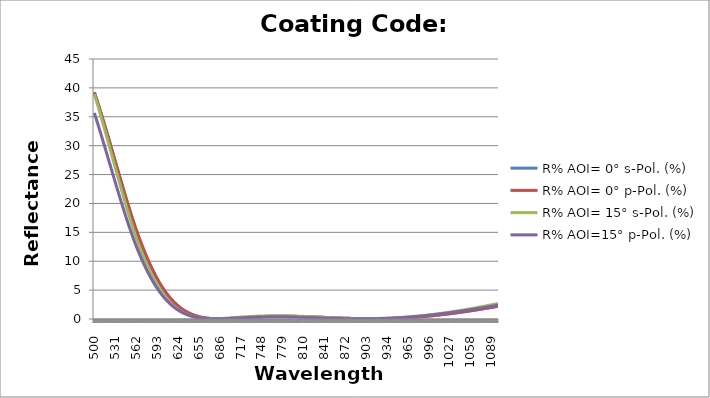
| Category | R% AOI= 0° s-Pol. (%) | R% AOI= 0° p-Pol. (%) | R% AOI= 15° s-Pol. (%) | R% AOI=15° p-Pol. (%) |
|---|---|---|---|---|
| 500.0 | 39.234 | 39.234 | 38.929 | 35.666 |
| 501.0 | 38.883 | 38.883 | 38.549 | 35.301 |
| 502.0 | 38.53 | 38.53 | 38.165 | 34.934 |
| 503.0 | 38.173 | 38.173 | 37.779 | 34.564 |
| 504.0 | 37.813 | 37.813 | 37.389 | 34.191 |
| 505.0 | 37.45 | 37.45 | 36.997 | 33.816 |
| 506.0 | 37.083 | 37.083 | 36.602 | 33.44 |
| 507.0 | 36.714 | 36.714 | 36.204 | 33.061 |
| 508.0 | 36.343 | 36.343 | 35.804 | 32.68 |
| 509.0 | 35.968 | 35.968 | 35.402 | 32.298 |
| 510.0 | 35.592 | 35.592 | 34.998 | 31.914 |
| 511.0 | 35.212 | 35.212 | 34.591 | 31.528 |
| 512.0 | 34.831 | 34.831 | 34.182 | 31.141 |
| 513.0 | 34.447 | 34.447 | 33.772 | 30.752 |
| 514.0 | 34.061 | 34.061 | 33.36 | 30.363 |
| 515.0 | 33.674 | 33.674 | 32.946 | 29.972 |
| 516.0 | 33.284 | 33.284 | 32.531 | 29.58 |
| 517.0 | 32.892 | 32.892 | 32.114 | 29.188 |
| 518.0 | 32.5 | 32.5 | 31.696 | 28.795 |
| 519.0 | 32.105 | 32.105 | 31.277 | 28.401 |
| 520.0 | 31.709 | 31.709 | 30.857 | 28.007 |
| 521.0 | 31.312 | 31.312 | 30.437 | 27.613 |
| 522.0 | 30.914 | 30.914 | 30.015 | 27.218 |
| 523.0 | 30.515 | 30.515 | 29.593 | 26.824 |
| 524.0 | 30.114 | 30.114 | 29.171 | 26.429 |
| 525.0 | 29.714 | 29.714 | 28.748 | 26.035 |
| 526.0 | 29.312 | 29.312 | 28.325 | 25.641 |
| 527.0 | 28.91 | 28.91 | 27.902 | 25.247 |
| 528.0 | 28.507 | 28.507 | 27.48 | 24.854 |
| 529.0 | 28.105 | 28.105 | 27.057 | 24.462 |
| 530.0 | 27.702 | 27.702 | 26.635 | 24.07 |
| 531.0 | 27.299 | 27.299 | 26.214 | 23.68 |
| 532.0 | 26.896 | 26.896 | 25.793 | 23.29 |
| 533.0 | 26.494 | 26.494 | 25.373 | 22.902 |
| 534.0 | 26.091 | 26.091 | 24.953 | 22.515 |
| 535.0 | 25.69 | 25.69 | 24.535 | 22.129 |
| 536.0 | 25.288 | 25.288 | 24.118 | 21.745 |
| 537.0 | 24.888 | 24.888 | 23.703 | 21.363 |
| 538.0 | 24.488 | 24.488 | 23.289 | 20.982 |
| 539.0 | 24.09 | 24.09 | 22.876 | 20.603 |
| 540.0 | 23.692 | 23.692 | 22.465 | 20.226 |
| 541.0 | 23.296 | 23.296 | 22.056 | 19.852 |
| 542.0 | 22.901 | 22.901 | 21.649 | 19.479 |
| 543.0 | 22.508 | 22.508 | 21.244 | 19.109 |
| 544.0 | 22.116 | 22.116 | 20.842 | 18.741 |
| 545.0 | 21.726 | 21.726 | 20.441 | 18.375 |
| 546.0 | 21.337 | 21.337 | 20.043 | 18.013 |
| 547.0 | 20.951 | 20.951 | 19.648 | 17.652 |
| 548.0 | 20.566 | 20.566 | 19.255 | 17.295 |
| 549.0 | 20.184 | 20.184 | 18.865 | 16.941 |
| 550.0 | 19.804 | 19.804 | 18.478 | 16.589 |
| 551.0 | 19.426 | 19.426 | 18.095 | 16.241 |
| 552.0 | 19.051 | 19.051 | 17.714 | 15.896 |
| 553.0 | 18.679 | 18.679 | 17.337 | 15.554 |
| 554.0 | 18.309 | 18.309 | 16.963 | 15.216 |
| 555.0 | 17.942 | 17.942 | 16.592 | 14.881 |
| 556.0 | 17.578 | 17.578 | 16.226 | 14.55 |
| 557.0 | 17.218 | 17.218 | 15.863 | 14.222 |
| 558.0 | 16.86 | 16.86 | 15.503 | 13.898 |
| 559.0 | 16.505 | 16.505 | 15.148 | 13.578 |
| 560.0 | 16.154 | 16.154 | 14.796 | 13.261 |
| 561.0 | 15.809 | 15.809 | 14.451 | 12.951 |
| 562.0 | 15.478 | 15.478 | 14.121 | 12.654 |
| 563.0 | 15.151 | 15.151 | 13.795 | 12.362 |
| 564.0 | 14.827 | 14.827 | 13.473 | 12.073 |
| 565.0 | 14.506 | 14.506 | 13.154 | 11.787 |
| 566.0 | 14.189 | 14.189 | 12.84 | 11.505 |
| 567.0 | 13.875 | 13.875 | 12.529 | 11.227 |
| 568.0 | 13.564 | 13.564 | 12.222 | 10.953 |
| 569.0 | 13.257 | 13.257 | 11.92 | 10.682 |
| 570.0 | 12.953 | 12.953 | 11.621 | 10.415 |
| 571.0 | 12.653 | 12.653 | 11.327 | 10.152 |
| 572.0 | 12.357 | 12.357 | 11.036 | 9.892 |
| 573.0 | 12.064 | 12.064 | 10.75 | 9.637 |
| 574.0 | 11.775 | 11.775 | 10.468 | 9.386 |
| 575.0 | 11.49 | 11.49 | 10.19 | 9.138 |
| 576.0 | 11.209 | 11.209 | 9.917 | 8.894 |
| 577.0 | 10.931 | 10.931 | 9.648 | 8.654 |
| 578.0 | 10.658 | 10.658 | 9.383 | 8.419 |
| 579.0 | 10.388 | 10.388 | 9.122 | 8.187 |
| 580.0 | 10.122 | 10.122 | 8.866 | 7.959 |
| 581.0 | 9.86 | 9.86 | 8.614 | 7.735 |
| 582.0 | 9.602 | 9.602 | 8.366 | 7.514 |
| 583.0 | 9.348 | 9.348 | 8.123 | 7.298 |
| 584.0 | 9.098 | 9.098 | 7.884 | 7.086 |
| 585.0 | 8.852 | 8.852 | 7.65 | 6.878 |
| 586.0 | 8.61 | 8.61 | 7.42 | 6.674 |
| 587.0 | 8.372 | 8.372 | 7.194 | 6.473 |
| 588.0 | 8.138 | 8.138 | 6.972 | 6.276 |
| 589.0 | 7.908 | 7.908 | 6.755 | 6.084 |
| 590.0 | 7.683 | 7.683 | 6.542 | 5.895 |
| 591.0 | 7.461 | 7.461 | 6.334 | 5.71 |
| 592.0 | 7.243 | 7.243 | 6.13 | 5.529 |
| 593.0 | 7.03 | 7.03 | 5.93 | 5.352 |
| 594.0 | 6.82 | 6.82 | 5.734 | 5.178 |
| 595.0 | 6.614 | 6.614 | 5.543 | 5.008 |
| 596.0 | 6.412 | 6.412 | 5.356 | 4.842 |
| 597.0 | 6.215 | 6.215 | 5.173 | 4.68 |
| 598.0 | 6.021 | 6.021 | 4.994 | 4.521 |
| 599.0 | 5.831 | 5.831 | 4.819 | 4.366 |
| 600.0 | 5.646 | 5.646 | 4.648 | 4.215 |
| 601.0 | 5.464 | 5.464 | 4.482 | 4.067 |
| 602.0 | 5.286 | 5.286 | 4.319 | 3.923 |
| 603.0 | 5.112 | 5.112 | 4.161 | 3.782 |
| 604.0 | 4.942 | 4.942 | 4.006 | 3.645 |
| 605.0 | 4.775 | 4.775 | 3.856 | 3.511 |
| 606.0 | 4.613 | 4.613 | 3.709 | 3.381 |
| 607.0 | 4.454 | 4.454 | 3.566 | 3.254 |
| 608.0 | 4.299 | 4.299 | 3.427 | 3.13 |
| 609.0 | 4.147 | 4.147 | 3.291 | 3.01 |
| 610.0 | 3.999 | 3.999 | 3.16 | 2.893 |
| 611.0 | 3.855 | 3.855 | 3.032 | 2.778 |
| 612.0 | 3.714 | 3.714 | 2.907 | 2.668 |
| 613.0 | 3.577 | 3.577 | 2.786 | 2.56 |
| 614.0 | 3.444 | 3.444 | 2.668 | 2.455 |
| 615.0 | 3.313 | 3.313 | 2.554 | 2.353 |
| 616.0 | 3.187 | 3.187 | 2.444 | 2.254 |
| 617.0 | 3.063 | 3.063 | 2.336 | 2.159 |
| 618.0 | 2.943 | 2.943 | 2.232 | 2.066 |
| 619.0 | 2.826 | 2.826 | 2.131 | 1.975 |
| 620.0 | 2.713 | 2.713 | 2.034 | 1.888 |
| 621.0 | 2.602 | 2.602 | 1.939 | 1.803 |
| 622.0 | 2.495 | 2.495 | 1.848 | 1.721 |
| 623.0 | 2.391 | 2.391 | 1.76 | 1.642 |
| 624.0 | 2.29 | 2.29 | 1.674 | 1.565 |
| 625.0 | 2.192 | 2.192 | 1.592 | 1.491 |
| 626.0 | 2.097 | 2.097 | 1.512 | 1.419 |
| 627.0 | 2.005 | 2.005 | 1.435 | 1.35 |
| 628.0 | 1.915 | 1.915 | 1.361 | 1.283 |
| 629.0 | 1.829 | 1.829 | 1.29 | 1.218 |
| 630.0 | 1.745 | 1.745 | 1.221 | 1.156 |
| 631.0 | 1.664 | 1.664 | 1.154 | 1.096 |
| 632.0 | 1.586 | 1.586 | 1.091 | 1.038 |
| 633.0 | 1.51 | 1.51 | 1.03 | 0.982 |
| 634.0 | 1.437 | 1.437 | 0.971 | 0.929 |
| 635.0 | 1.366 | 1.366 | 0.915 | 0.877 |
| 636.0 | 1.298 | 1.298 | 0.861 | 0.828 |
| 637.0 | 1.232 | 1.232 | 0.809 | 0.78 |
| 638.0 | 1.169 | 1.169 | 0.759 | 0.735 |
| 639.0 | 1.108 | 1.108 | 0.712 | 0.691 |
| 640.0 | 1.049 | 1.049 | 0.667 | 0.649 |
| 641.0 | 0.992 | 0.992 | 0.623 | 0.609 |
| 642.0 | 0.938 | 0.938 | 0.582 | 0.571 |
| 643.0 | 0.886 | 0.886 | 0.543 | 0.534 |
| 644.0 | 0.836 | 0.836 | 0.505 | 0.499 |
| 645.0 | 0.788 | 0.788 | 0.47 | 0.466 |
| 646.0 | 0.742 | 0.742 | 0.436 | 0.434 |
| 647.0 | 0.697 | 0.697 | 0.404 | 0.404 |
| 648.0 | 0.655 | 0.655 | 0.374 | 0.375 |
| 649.0 | 0.615 | 0.615 | 0.345 | 0.348 |
| 650.0 | 0.576 | 0.576 | 0.318 | 0.322 |
| 651.0 | 0.539 | 0.539 | 0.293 | 0.298 |
| 652.0 | 0.504 | 0.504 | 0.269 | 0.274 |
| 653.0 | 0.47 | 0.47 | 0.247 | 0.253 |
| 654.0 | 0.439 | 0.439 | 0.226 | 0.232 |
| 655.0 | 0.408 | 0.408 | 0.206 | 0.213 |
| 656.0 | 0.38 | 0.38 | 0.188 | 0.194 |
| 657.0 | 0.352 | 0.352 | 0.171 | 0.177 |
| 658.0 | 0.327 | 0.327 | 0.156 | 0.161 |
| 659.0 | 0.302 | 0.302 | 0.141 | 0.146 |
| 660.0 | 0.279 | 0.279 | 0.128 | 0.132 |
| 661.0 | 0.258 | 0.258 | 0.116 | 0.12 |
| 662.0 | 0.237 | 0.237 | 0.105 | 0.108 |
| 663.0 | 0.218 | 0.218 | 0.095 | 0.097 |
| 664.0 | 0.2 | 0.2 | 0.086 | 0.087 |
| 665.0 | 0.184 | 0.184 | 0.078 | 0.078 |
| 666.0 | 0.168 | 0.168 | 0.071 | 0.069 |
| 667.0 | 0.154 | 0.154 | 0.065 | 0.062 |
| 668.0 | 0.141 | 0.141 | 0.06 | 0.055 |
| 669.0 | 0.129 | 0.129 | 0.055 | 0.049 |
| 670.0 | 0.117 | 0.117 | 0.052 | 0.044 |
| 671.0 | 0.107 | 0.107 | 0.049 | 0.039 |
| 672.0 | 0.097 | 0.097 | 0.046 | 0.035 |
| 673.0 | 0.089 | 0.089 | 0.045 | 0.032 |
| 674.0 | 0.081 | 0.081 | 0.044 | 0.029 |
| 675.0 | 0.074 | 0.074 | 0.044 | 0.027 |
| 676.0 | 0.068 | 0.068 | 0.045 | 0.026 |
| 677.0 | 0.063 | 0.063 | 0.046 | 0.025 |
| 678.0 | 0.058 | 0.058 | 0.048 | 0.024 |
| 679.0 | 0.054 | 0.054 | 0.05 | 0.024 |
| 680.0 | 0.051 | 0.051 | 0.052 | 0.024 |
| 681.0 | 0.048 | 0.048 | 0.056 | 0.025 |
| 682.0 | 0.046 | 0.046 | 0.059 | 0.026 |
| 683.0 | 0.045 | 0.045 | 0.063 | 0.028 |
| 684.0 | 0.044 | 0.044 | 0.068 | 0.03 |
| 685.0 | 0.044 | 0.044 | 0.073 | 0.032 |
| 686.0 | 0.044 | 0.044 | 0.078 | 0.035 |
| 687.0 | 0.045 | 0.045 | 0.084 | 0.038 |
| 688.0 | 0.046 | 0.046 | 0.09 | 0.042 |
| 689.0 | 0.048 | 0.048 | 0.096 | 0.045 |
| 690.0 | 0.05 | 0.05 | 0.102 | 0.049 |
| 691.0 | 0.053 | 0.053 | 0.109 | 0.053 |
| 692.0 | 0.056 | 0.056 | 0.116 | 0.058 |
| 693.0 | 0.059 | 0.059 | 0.123 | 0.062 |
| 694.0 | 0.063 | 0.063 | 0.131 | 0.067 |
| 695.0 | 0.067 | 0.067 | 0.138 | 0.072 |
| 696.0 | 0.071 | 0.071 | 0.146 | 0.077 |
| 697.0 | 0.076 | 0.076 | 0.154 | 0.083 |
| 698.0 | 0.081 | 0.081 | 0.162 | 0.088 |
| 699.0 | 0.086 | 0.086 | 0.17 | 0.094 |
| 700.0 | 0.091 | 0.091 | 0.179 | 0.1 |
| 701.0 | 0.097 | 0.097 | 0.187 | 0.105 |
| 702.0 | 0.102 | 0.102 | 0.196 | 0.111 |
| 703.0 | 0.108 | 0.108 | 0.204 | 0.117 |
| 704.0 | 0.115 | 0.115 | 0.213 | 0.124 |
| 705.0 | 0.121 | 0.121 | 0.222 | 0.13 |
| 706.0 | 0.128 | 0.128 | 0.23 | 0.136 |
| 707.0 | 0.134 | 0.134 | 0.239 | 0.142 |
| 708.0 | 0.141 | 0.141 | 0.248 | 0.148 |
| 709.0 | 0.148 | 0.148 | 0.257 | 0.155 |
| 710.0 | 0.155 | 0.155 | 0.265 | 0.161 |
| 711.0 | 0.162 | 0.162 | 0.274 | 0.167 |
| 712.0 | 0.169 | 0.169 | 0.283 | 0.174 |
| 713.0 | 0.176 | 0.176 | 0.291 | 0.18 |
| 714.0 | 0.183 | 0.183 | 0.3 | 0.186 |
| 715.0 | 0.19 | 0.19 | 0.308 | 0.192 |
| 716.0 | 0.197 | 0.197 | 0.317 | 0.199 |
| 717.0 | 0.205 | 0.205 | 0.325 | 0.205 |
| 718.0 | 0.212 | 0.212 | 0.334 | 0.211 |
| 719.0 | 0.219 | 0.219 | 0.342 | 0.217 |
| 720.0 | 0.226 | 0.226 | 0.35 | 0.223 |
| 721.0 | 0.234 | 0.234 | 0.358 | 0.229 |
| 722.0 | 0.241 | 0.241 | 0.366 | 0.235 |
| 723.0 | 0.248 | 0.248 | 0.373 | 0.24 |
| 724.0 | 0.255 | 0.255 | 0.381 | 0.246 |
| 725.0 | 0.262 | 0.262 | 0.389 | 0.252 |
| 726.0 | 0.269 | 0.269 | 0.396 | 0.257 |
| 727.0 | 0.276 | 0.276 | 0.403 | 0.263 |
| 728.0 | 0.283 | 0.283 | 0.41 | 0.268 |
| 729.0 | 0.29 | 0.29 | 0.417 | 0.273 |
| 730.0 | 0.297 | 0.297 | 0.424 | 0.278 |
| 731.0 | 0.303 | 0.303 | 0.431 | 0.283 |
| 732.0 | 0.31 | 0.31 | 0.437 | 0.288 |
| 733.0 | 0.316 | 0.316 | 0.443 | 0.293 |
| 734.0 | 0.323 | 0.323 | 0.45 | 0.298 |
| 735.0 | 0.329 | 0.329 | 0.456 | 0.302 |
| 736.0 | 0.336 | 0.336 | 0.462 | 0.307 |
| 737.0 | 0.342 | 0.342 | 0.469 | 0.312 |
| 738.0 | 0.348 | 0.348 | 0.475 | 0.316 |
| 739.0 | 0.355 | 0.355 | 0.48 | 0.321 |
| 740.0 | 0.361 | 0.361 | 0.486 | 0.325 |
| 741.0 | 0.367 | 0.367 | 0.492 | 0.329 |
| 742.0 | 0.372 | 0.372 | 0.497 | 0.333 |
| 743.0 | 0.378 | 0.378 | 0.502 | 0.337 |
| 744.0 | 0.384 | 0.384 | 0.507 | 0.341 |
| 745.0 | 0.389 | 0.389 | 0.511 | 0.344 |
| 746.0 | 0.394 | 0.394 | 0.516 | 0.348 |
| 747.0 | 0.399 | 0.399 | 0.52 | 0.351 |
| 748.0 | 0.404 | 0.404 | 0.525 | 0.354 |
| 749.0 | 0.409 | 0.409 | 0.529 | 0.357 |
| 750.0 | 0.414 | 0.414 | 0.532 | 0.36 |
| 751.0 | 0.418 | 0.418 | 0.536 | 0.363 |
| 752.0 | 0.423 | 0.423 | 0.539 | 0.365 |
| 753.0 | 0.427 | 0.427 | 0.543 | 0.368 |
| 754.0 | 0.431 | 0.431 | 0.546 | 0.37 |
| 755.0 | 0.435 | 0.435 | 0.548 | 0.372 |
| 756.0 | 0.438 | 0.438 | 0.551 | 0.374 |
| 757.0 | 0.442 | 0.442 | 0.554 | 0.376 |
| 758.0 | 0.445 | 0.445 | 0.556 | 0.377 |
| 759.0 | 0.449 | 0.449 | 0.558 | 0.379 |
| 760.0 | 0.452 | 0.452 | 0.56 | 0.38 |
| 761.0 | 0.455 | 0.455 | 0.562 | 0.382 |
| 762.0 | 0.457 | 0.457 | 0.563 | 0.383 |
| 763.0 | 0.46 | 0.46 | 0.564 | 0.384 |
| 764.0 | 0.462 | 0.462 | 0.566 | 0.384 |
| 765.0 | 0.465 | 0.465 | 0.567 | 0.385 |
| 766.0 | 0.467 | 0.467 | 0.567 | 0.386 |
| 767.0 | 0.469 | 0.469 | 0.568 | 0.386 |
| 768.0 | 0.47 | 0.47 | 0.568 | 0.386 |
| 769.0 | 0.472 | 0.472 | 0.569 | 0.387 |
| 770.0 | 0.473 | 0.473 | 0.569 | 0.387 |
| 771.0 | 0.475 | 0.475 | 0.569 | 0.386 |
| 772.0 | 0.476 | 0.476 | 0.568 | 0.386 |
| 773.0 | 0.477 | 0.477 | 0.568 | 0.386 |
| 774.0 | 0.478 | 0.478 | 0.568 | 0.385 |
| 775.0 | 0.478 | 0.478 | 0.567 | 0.385 |
| 776.0 | 0.479 | 0.479 | 0.566 | 0.384 |
| 777.0 | 0.479 | 0.479 | 0.565 | 0.383 |
| 778.0 | 0.479 | 0.479 | 0.564 | 0.382 |
| 779.0 | 0.48 | 0.48 | 0.562 | 0.381 |
| 780.0 | 0.479 | 0.479 | 0.561 | 0.38 |
| 781.0 | 0.479 | 0.479 | 0.559 | 0.378 |
| 782.0 | 0.479 | 0.479 | 0.557 | 0.377 |
| 783.0 | 0.478 | 0.478 | 0.555 | 0.375 |
| 784.0 | 0.478 | 0.478 | 0.553 | 0.373 |
| 785.0 | 0.477 | 0.477 | 0.551 | 0.372 |
| 786.0 | 0.476 | 0.476 | 0.549 | 0.37 |
| 787.0 | 0.475 | 0.475 | 0.546 | 0.368 |
| 788.0 | 0.474 | 0.474 | 0.543 | 0.366 |
| 789.0 | 0.472 | 0.472 | 0.541 | 0.363 |
| 790.0 | 0.471 | 0.471 | 0.538 | 0.361 |
| 791.0 | 0.469 | 0.469 | 0.535 | 0.359 |
| 792.0 | 0.467 | 0.467 | 0.532 | 0.356 |
| 793.0 | 0.466 | 0.466 | 0.528 | 0.353 |
| 794.0 | 0.464 | 0.464 | 0.525 | 0.351 |
| 795.0 | 0.461 | 0.461 | 0.521 | 0.348 |
| 796.0 | 0.459 | 0.459 | 0.518 | 0.345 |
| 797.0 | 0.457 | 0.457 | 0.514 | 0.342 |
| 798.0 | 0.454 | 0.454 | 0.51 | 0.339 |
| 799.0 | 0.452 | 0.452 | 0.506 | 0.336 |
| 800.0 | 0.449 | 0.449 | 0.502 | 0.333 |
| 801.0 | 0.446 | 0.446 | 0.498 | 0.33 |
| 802.0 | 0.443 | 0.443 | 0.494 | 0.326 |
| 803.0 | 0.44 | 0.44 | 0.489 | 0.323 |
| 804.0 | 0.437 | 0.437 | 0.485 | 0.319 |
| 805.0 | 0.434 | 0.434 | 0.48 | 0.316 |
| 806.0 | 0.431 | 0.431 | 0.476 | 0.312 |
| 807.0 | 0.428 | 0.428 | 0.471 | 0.309 |
| 808.0 | 0.424 | 0.424 | 0.466 | 0.305 |
| 809.0 | 0.42 | 0.42 | 0.462 | 0.301 |
| 810.0 | 0.417 | 0.417 | 0.457 | 0.297 |
| 811.0 | 0.413 | 0.413 | 0.452 | 0.294 |
| 812.0 | 0.409 | 0.409 | 0.447 | 0.29 |
| 813.0 | 0.405 | 0.405 | 0.442 | 0.286 |
| 814.0 | 0.402 | 0.402 | 0.437 | 0.282 |
| 815.0 | 0.398 | 0.398 | 0.432 | 0.278 |
| 816.0 | 0.393 | 0.393 | 0.426 | 0.274 |
| 817.0 | 0.389 | 0.389 | 0.421 | 0.27 |
| 818.0 | 0.385 | 0.385 | 0.416 | 0.266 |
| 819.0 | 0.381 | 0.381 | 0.41 | 0.261 |
| 820.0 | 0.376 | 0.376 | 0.405 | 0.257 |
| 821.0 | 0.372 | 0.372 | 0.4 | 0.253 |
| 822.0 | 0.368 | 0.368 | 0.394 | 0.249 |
| 823.0 | 0.363 | 0.363 | 0.389 | 0.245 |
| 824.0 | 0.358 | 0.358 | 0.383 | 0.24 |
| 825.0 | 0.354 | 0.354 | 0.378 | 0.236 |
| 826.0 | 0.349 | 0.349 | 0.372 | 0.232 |
| 827.0 | 0.344 | 0.344 | 0.366 | 0.228 |
| 828.0 | 0.34 | 0.34 | 0.361 | 0.223 |
| 829.0 | 0.335 | 0.335 | 0.355 | 0.219 |
| 830.0 | 0.33 | 0.33 | 0.349 | 0.215 |
| 831.0 | 0.325 | 0.325 | 0.344 | 0.21 |
| 832.0 | 0.321 | 0.321 | 0.338 | 0.206 |
| 833.0 | 0.316 | 0.316 | 0.332 | 0.202 |
| 834.0 | 0.311 | 0.311 | 0.327 | 0.198 |
| 835.0 | 0.306 | 0.306 | 0.321 | 0.193 |
| 836.0 | 0.301 | 0.301 | 0.316 | 0.189 |
| 837.0 | 0.296 | 0.296 | 0.31 | 0.185 |
| 838.0 | 0.291 | 0.291 | 0.304 | 0.18 |
| 839.0 | 0.286 | 0.286 | 0.299 | 0.176 |
| 840.0 | 0.281 | 0.281 | 0.293 | 0.172 |
| 841.0 | 0.276 | 0.276 | 0.287 | 0.168 |
| 842.0 | 0.271 | 0.271 | 0.282 | 0.164 |
| 843.0 | 0.266 | 0.266 | 0.276 | 0.16 |
| 844.0 | 0.261 | 0.261 | 0.271 | 0.156 |
| 845.0 | 0.256 | 0.256 | 0.265 | 0.152 |
| 846.0 | 0.251 | 0.251 | 0.26 | 0.148 |
| 847.0 | 0.246 | 0.246 | 0.255 | 0.144 |
| 848.0 | 0.242 | 0.242 | 0.249 | 0.14 |
| 849.0 | 0.237 | 0.237 | 0.244 | 0.136 |
| 850.0 | 0.232 | 0.232 | 0.239 | 0.132 |
| 851.0 | 0.227 | 0.227 | 0.234 | 0.128 |
| 852.0 | 0.222 | 0.222 | 0.228 | 0.124 |
| 853.0 | 0.217 | 0.217 | 0.223 | 0.121 |
| 854.0 | 0.212 | 0.212 | 0.218 | 0.117 |
| 855.0 | 0.208 | 0.208 | 0.213 | 0.113 |
| 856.0 | 0.203 | 0.203 | 0.208 | 0.11 |
| 857.0 | 0.198 | 0.198 | 0.203 | 0.106 |
| 858.0 | 0.194 | 0.194 | 0.198 | 0.103 |
| 859.0 | 0.189 | 0.189 | 0.194 | 0.1 |
| 860.0 | 0.184 | 0.184 | 0.189 | 0.096 |
| 861.0 | 0.18 | 0.18 | 0.184 | 0.093 |
| 862.0 | 0.175 | 0.175 | 0.18 | 0.09 |
| 863.0 | 0.171 | 0.171 | 0.175 | 0.087 |
| 864.0 | 0.166 | 0.166 | 0.171 | 0.084 |
| 865.0 | 0.162 | 0.162 | 0.166 | 0.081 |
| 866.0 | 0.158 | 0.158 | 0.162 | 0.078 |
| 867.0 | 0.154 | 0.154 | 0.158 | 0.075 |
| 868.0 | 0.149 | 0.149 | 0.154 | 0.072 |
| 869.0 | 0.145 | 0.145 | 0.15 | 0.069 |
| 870.0 | 0.141 | 0.141 | 0.146 | 0.067 |
| 871.0 | 0.137 | 0.137 | 0.142 | 0.064 |
| 872.0 | 0.133 | 0.133 | 0.138 | 0.062 |
| 873.0 | 0.129 | 0.129 | 0.135 | 0.059 |
| 874.0 | 0.126 | 0.126 | 0.131 | 0.057 |
| 875.0 | 0.122 | 0.122 | 0.128 | 0.055 |
| 876.0 | 0.118 | 0.118 | 0.124 | 0.053 |
| 877.0 | 0.114 | 0.114 | 0.121 | 0.051 |
| 878.0 | 0.111 | 0.111 | 0.118 | 0.049 |
| 879.0 | 0.108 | 0.108 | 0.115 | 0.047 |
| 880.0 | 0.104 | 0.104 | 0.112 | 0.045 |
| 881.0 | 0.101 | 0.101 | 0.109 | 0.044 |
| 882.0 | 0.098 | 0.098 | 0.106 | 0.042 |
| 883.0 | 0.095 | 0.095 | 0.104 | 0.041 |
| 884.0 | 0.092 | 0.092 | 0.101 | 0.039 |
| 885.0 | 0.089 | 0.089 | 0.099 | 0.038 |
| 886.0 | 0.086 | 0.086 | 0.097 | 0.037 |
| 887.0 | 0.083 | 0.083 | 0.094 | 0.036 |
| 888.0 | 0.08 | 0.08 | 0.092 | 0.035 |
| 889.0 | 0.078 | 0.078 | 0.09 | 0.034 |
| 890.0 | 0.075 | 0.075 | 0.089 | 0.033 |
| 891.0 | 0.073 | 0.073 | 0.087 | 0.032 |
| 892.0 | 0.071 | 0.071 | 0.085 | 0.032 |
| 893.0 | 0.069 | 0.069 | 0.084 | 0.031 |
| 894.0 | 0.066 | 0.066 | 0.083 | 0.031 |
| 895.0 | 0.064 | 0.064 | 0.081 | 0.031 |
| 896.0 | 0.063 | 0.063 | 0.08 | 0.031 |
| 897.0 | 0.061 | 0.061 | 0.079 | 0.031 |
| 898.0 | 0.059 | 0.059 | 0.078 | 0.031 |
| 899.0 | 0.058 | 0.058 | 0.078 | 0.031 |
| 900.0 | 0.056 | 0.056 | 0.077 | 0.031 |
| 901.0 | 0.055 | 0.055 | 0.077 | 0.032 |
| 902.0 | 0.053 | 0.053 | 0.076 | 0.032 |
| 903.0 | 0.052 | 0.052 | 0.076 | 0.033 |
| 904.0 | 0.051 | 0.051 | 0.076 | 0.034 |
| 905.0 | 0.05 | 0.05 | 0.076 | 0.035 |
| 906.0 | 0.05 | 0.05 | 0.077 | 0.036 |
| 907.0 | 0.049 | 0.049 | 0.077 | 0.037 |
| 908.0 | 0.048 | 0.048 | 0.078 | 0.038 |
| 909.0 | 0.048 | 0.048 | 0.078 | 0.04 |
| 910.0 | 0.047 | 0.047 | 0.079 | 0.041 |
| 911.0 | 0.047 | 0.047 | 0.08 | 0.043 |
| 912.0 | 0.047 | 0.047 | 0.081 | 0.044 |
| 913.0 | 0.047 | 0.047 | 0.082 | 0.046 |
| 914.0 | 0.047 | 0.047 | 0.084 | 0.048 |
| 915.0 | 0.047 | 0.047 | 0.085 | 0.05 |
| 916.0 | 0.048 | 0.048 | 0.087 | 0.052 |
| 917.0 | 0.048 | 0.048 | 0.088 | 0.055 |
| 918.0 | 0.049 | 0.049 | 0.09 | 0.057 |
| 919.0 | 0.05 | 0.05 | 0.092 | 0.06 |
| 920.0 | 0.05 | 0.05 | 0.095 | 0.063 |
| 921.0 | 0.052 | 0.052 | 0.097 | 0.066 |
| 922.0 | 0.053 | 0.053 | 0.1 | 0.068 |
| 923.0 | 0.054 | 0.054 | 0.102 | 0.072 |
| 924.0 | 0.055 | 0.055 | 0.105 | 0.075 |
| 925.0 | 0.057 | 0.057 | 0.108 | 0.078 |
| 926.0 | 0.058 | 0.058 | 0.111 | 0.082 |
| 927.0 | 0.06 | 0.06 | 0.114 | 0.085 |
| 928.0 | 0.062 | 0.062 | 0.118 | 0.089 |
| 929.0 | 0.064 | 0.064 | 0.121 | 0.093 |
| 930.0 | 0.066 | 0.066 | 0.125 | 0.097 |
| 931.0 | 0.068 | 0.068 | 0.129 | 0.101 |
| 932.0 | 0.071 | 0.071 | 0.133 | 0.105 |
| 933.0 | 0.073 | 0.073 | 0.137 | 0.11 |
| 934.0 | 0.076 | 0.076 | 0.141 | 0.114 |
| 935.0 | 0.079 | 0.079 | 0.146 | 0.119 |
| 936.0 | 0.082 | 0.082 | 0.15 | 0.124 |
| 937.0 | 0.085 | 0.085 | 0.155 | 0.129 |
| 938.0 | 0.088 | 0.088 | 0.16 | 0.134 |
| 939.0 | 0.091 | 0.091 | 0.165 | 0.139 |
| 940.0 | 0.095 | 0.095 | 0.171 | 0.144 |
| 941.0 | 0.098 | 0.098 | 0.176 | 0.15 |
| 942.0 | 0.102 | 0.102 | 0.182 | 0.155 |
| 943.0 | 0.106 | 0.106 | 0.187 | 0.161 |
| 944.0 | 0.11 | 0.11 | 0.193 | 0.167 |
| 945.0 | 0.114 | 0.114 | 0.199 | 0.173 |
| 946.0 | 0.119 | 0.119 | 0.205 | 0.179 |
| 947.0 | 0.123 | 0.123 | 0.212 | 0.185 |
| 948.0 | 0.128 | 0.128 | 0.218 | 0.191 |
| 949.0 | 0.132 | 0.132 | 0.225 | 0.198 |
| 950.0 | 0.137 | 0.137 | 0.231 | 0.204 |
| 951.0 | 0.142 | 0.142 | 0.238 | 0.211 |
| 952.0 | 0.147 | 0.147 | 0.245 | 0.218 |
| 953.0 | 0.153 | 0.153 | 0.253 | 0.225 |
| 954.0 | 0.158 | 0.158 | 0.26 | 0.232 |
| 955.0 | 0.164 | 0.164 | 0.268 | 0.239 |
| 956.0 | 0.169 | 0.169 | 0.275 | 0.247 |
| 957.0 | 0.175 | 0.175 | 0.283 | 0.254 |
| 958.0 | 0.181 | 0.181 | 0.291 | 0.262 |
| 959.0 | 0.187 | 0.187 | 0.299 | 0.27 |
| 960.0 | 0.193 | 0.193 | 0.308 | 0.278 |
| 961.0 | 0.2 | 0.2 | 0.316 | 0.286 |
| 962.0 | 0.206 | 0.206 | 0.324 | 0.294 |
| 963.0 | 0.213 | 0.213 | 0.333 | 0.302 |
| 964.0 | 0.22 | 0.22 | 0.342 | 0.31 |
| 965.0 | 0.226 | 0.226 | 0.351 | 0.319 |
| 966.0 | 0.233 | 0.233 | 0.36 | 0.328 |
| 967.0 | 0.241 | 0.241 | 0.37 | 0.336 |
| 968.0 | 0.248 | 0.248 | 0.379 | 0.345 |
| 969.0 | 0.255 | 0.255 | 0.389 | 0.354 |
| 970.0 | 0.263 | 0.263 | 0.399 | 0.364 |
| 971.0 | 0.271 | 0.271 | 0.409 | 0.373 |
| 972.0 | 0.279 | 0.279 | 0.419 | 0.382 |
| 973.0 | 0.287 | 0.287 | 0.429 | 0.392 |
| 974.0 | 0.295 | 0.295 | 0.439 | 0.402 |
| 975.0 | 0.303 | 0.303 | 0.45 | 0.411 |
| 976.0 | 0.311 | 0.311 | 0.461 | 0.421 |
| 977.0 | 0.32 | 0.32 | 0.472 | 0.431 |
| 978.0 | 0.329 | 0.329 | 0.482 | 0.441 |
| 979.0 | 0.337 | 0.337 | 0.494 | 0.452 |
| 980.0 | 0.346 | 0.346 | 0.505 | 0.462 |
| 981.0 | 0.355 | 0.355 | 0.516 | 0.473 |
| 982.0 | 0.365 | 0.365 | 0.528 | 0.483 |
| 983.0 | 0.374 | 0.374 | 0.54 | 0.494 |
| 984.0 | 0.384 | 0.384 | 0.551 | 0.505 |
| 985.0 | 0.393 | 0.393 | 0.563 | 0.516 |
| 986.0 | 0.403 | 0.403 | 0.576 | 0.527 |
| 987.0 | 0.413 | 0.413 | 0.588 | 0.538 |
| 988.0 | 0.423 | 0.423 | 0.6 | 0.55 |
| 989.0 | 0.433 | 0.433 | 0.613 | 0.561 |
| 990.0 | 0.443 | 0.443 | 0.625 | 0.573 |
| 991.0 | 0.454 | 0.454 | 0.638 | 0.585 |
| 992.0 | 0.464 | 0.464 | 0.651 | 0.596 |
| 993.0 | 0.475 | 0.475 | 0.664 | 0.608 |
| 994.0 | 0.485 | 0.485 | 0.677 | 0.62 |
| 995.0 | 0.496 | 0.496 | 0.691 | 0.633 |
| 996.0 | 0.507 | 0.507 | 0.704 | 0.645 |
| 997.0 | 0.518 | 0.518 | 0.718 | 0.657 |
| 998.0 | 0.53 | 0.53 | 0.732 | 0.67 |
| 999.0 | 0.541 | 0.541 | 0.746 | 0.682 |
| 1000.0 | 0.553 | 0.553 | 0.76 | 0.695 |
| 1001.0 | 0.564 | 0.564 | 0.774 | 0.708 |
| 1002.0 | 0.576 | 0.576 | 0.788 | 0.721 |
| 1003.0 | 0.588 | 0.588 | 0.803 | 0.734 |
| 1004.0 | 0.6 | 0.6 | 0.817 | 0.747 |
| 1005.0 | 0.612 | 0.612 | 0.832 | 0.761 |
| 1006.0 | 0.625 | 0.625 | 0.847 | 0.774 |
| 1007.0 | 0.637 | 0.637 | 0.862 | 0.788 |
| 1008.0 | 0.65 | 0.65 | 0.877 | 0.801 |
| 1009.0 | 0.662 | 0.662 | 0.892 | 0.815 |
| 1010.0 | 0.675 | 0.675 | 0.907 | 0.829 |
| 1011.0 | 0.688 | 0.688 | 0.923 | 0.843 |
| 1012.0 | 0.701 | 0.701 | 0.938 | 0.857 |
| 1013.0 | 0.714 | 0.714 | 0.954 | 0.871 |
| 1014.0 | 0.727 | 0.727 | 0.97 | 0.885 |
| 1015.0 | 0.741 | 0.741 | 0.986 | 0.899 |
| 1016.0 | 0.754 | 0.754 | 1.002 | 0.914 |
| 1017.0 | 0.768 | 0.768 | 1.018 | 0.928 |
| 1018.0 | 0.781 | 0.781 | 1.034 | 0.943 |
| 1019.0 | 0.795 | 0.795 | 1.051 | 0.958 |
| 1020.0 | 0.809 | 0.809 | 1.067 | 0.973 |
| 1021.0 | 0.823 | 0.823 | 1.084 | 0.988 |
| 1022.0 | 0.837 | 0.837 | 1.101 | 1.003 |
| 1023.0 | 0.852 | 0.852 | 1.117 | 1.018 |
| 1024.0 | 0.866 | 0.866 | 1.134 | 1.033 |
| 1025.0 | 0.88 | 0.88 | 1.152 | 1.048 |
| 1026.0 | 0.895 | 0.895 | 1.169 | 1.064 |
| 1027.0 | 0.91 | 0.91 | 1.186 | 1.079 |
| 1028.0 | 0.924 | 0.924 | 1.204 | 1.095 |
| 1029.0 | 0.94 | 0.94 | 1.221 | 1.111 |
| 1030.0 | 0.954 | 0.954 | 1.239 | 1.126 |
| 1031.0 | 0.97 | 0.97 | 1.256 | 1.142 |
| 1032.0 | 0.985 | 0.985 | 1.274 | 1.158 |
| 1033.0 | 1 | 1 | 1.292 | 1.174 |
| 1034.0 | 1.016 | 1.016 | 1.31 | 1.19 |
| 1035.0 | 1.031 | 1.031 | 1.329 | 1.207 |
| 1036.0 | 1.047 | 1.047 | 1.347 | 1.223 |
| 1037.0 | 1.063 | 1.063 | 1.365 | 1.239 |
| 1038.0 | 1.078 | 1.078 | 1.384 | 1.256 |
| 1039.0 | 1.094 | 1.094 | 1.402 | 1.272 |
| 1040.0 | 1.11 | 1.11 | 1.421 | 1.289 |
| 1041.0 | 1.127 | 1.127 | 1.44 | 1.306 |
| 1042.0 | 1.143 | 1.143 | 1.459 | 1.323 |
| 1043.0 | 1.159 | 1.159 | 1.478 | 1.34 |
| 1044.0 | 1.176 | 1.176 | 1.497 | 1.357 |
| 1045.0 | 1.192 | 1.192 | 1.516 | 1.374 |
| 1046.0 | 1.209 | 1.209 | 1.536 | 1.391 |
| 1047.0 | 1.226 | 1.226 | 1.555 | 1.408 |
| 1048.0 | 1.242 | 1.242 | 1.574 | 1.425 |
| 1049.0 | 1.259 | 1.259 | 1.594 | 1.443 |
| 1050.0 | 1.276 | 1.276 | 1.614 | 1.46 |
| 1051.0 | 1.294 | 1.294 | 1.633 | 1.478 |
| 1052.0 | 1.311 | 1.311 | 1.653 | 1.496 |
| 1053.0 | 1.328 | 1.328 | 1.673 | 1.513 |
| 1054.0 | 1.345 | 1.345 | 1.693 | 1.531 |
| 1055.0 | 1.363 | 1.363 | 1.713 | 1.549 |
| 1056.0 | 1.38 | 1.38 | 1.733 | 1.567 |
| 1057.0 | 1.398 | 1.398 | 1.754 | 1.585 |
| 1058.0 | 1.416 | 1.416 | 1.774 | 1.603 |
| 1059.0 | 1.434 | 1.434 | 1.794 | 1.621 |
| 1060.0 | 1.451 | 1.451 | 1.815 | 1.639 |
| 1061.0 | 1.469 | 1.469 | 1.836 | 1.657 |
| 1062.0 | 1.487 | 1.487 | 1.856 | 1.676 |
| 1063.0 | 1.506 | 1.506 | 1.877 | 1.694 |
| 1064.0 | 1.524 | 1.524 | 1.898 | 1.712 |
| 1065.0 | 1.542 | 1.542 | 1.919 | 1.731 |
| 1066.0 | 1.56 | 1.56 | 1.94 | 1.75 |
| 1067.0 | 1.579 | 1.579 | 1.961 | 1.768 |
| 1068.0 | 1.597 | 1.597 | 1.982 | 1.787 |
| 1069.0 | 1.616 | 1.616 | 2.003 | 1.806 |
| 1070.0 | 1.635 | 1.635 | 2.025 | 1.825 |
| 1071.0 | 1.653 | 1.653 | 2.046 | 1.844 |
| 1072.0 | 1.672 | 1.672 | 2.068 | 1.862 |
| 1073.0 | 1.691 | 1.691 | 2.089 | 1.882 |
| 1074.0 | 1.71 | 1.71 | 2.111 | 1.901 |
| 1075.0 | 1.729 | 1.729 | 2.132 | 1.92 |
| 1076.0 | 1.748 | 1.748 | 2.154 | 1.939 |
| 1077.0 | 1.768 | 1.768 | 2.176 | 1.958 |
| 1078.0 | 1.787 | 1.787 | 2.198 | 1.978 |
| 1079.0 | 1.806 | 1.806 | 2.22 | 1.997 |
| 1080.0 | 1.826 | 1.826 | 2.242 | 2.016 |
| 1081.0 | 1.845 | 1.845 | 2.264 | 2.036 |
| 1082.0 | 1.865 | 1.865 | 2.286 | 2.055 |
| 1083.0 | 1.884 | 1.884 | 2.308 | 2.075 |
| 1084.0 | 1.904 | 1.904 | 2.33 | 2.094 |
| 1085.0 | 1.924 | 1.924 | 2.353 | 2.114 |
| 1086.0 | 1.943 | 1.943 | 2.375 | 2.134 |
| 1087.0 | 1.963 | 1.963 | 2.397 | 2.154 |
| 1088.0 | 1.983 | 1.983 | 2.42 | 2.174 |
| 1089.0 | 2.003 | 2.003 | 2.443 | 2.194 |
| 1090.0 | 2.023 | 2.023 | 2.465 | 2.214 |
| 1091.0 | 2.044 | 2.044 | 2.488 | 2.234 |
| 1092.0 | 2.064 | 2.064 | 2.511 | 2.254 |
| 1093.0 | 2.084 | 2.084 | 2.534 | 2.274 |
| 1094.0 | 2.104 | 2.104 | 2.556 | 2.294 |
| 1095.0 | 2.125 | 2.125 | 2.579 | 2.314 |
| 1096.0 | 2.145 | 2.145 | 2.602 | 2.334 |
| 1097.0 | 2.166 | 2.166 | 2.625 | 2.355 |
| 1098.0 | 2.186 | 2.186 | 2.648 | 2.375 |
| 1099.0 | 2.207 | 2.207 | 2.672 | 2.395 |
| 1100.0 | 2.228 | 2.228 | 2.695 | 2.416 |